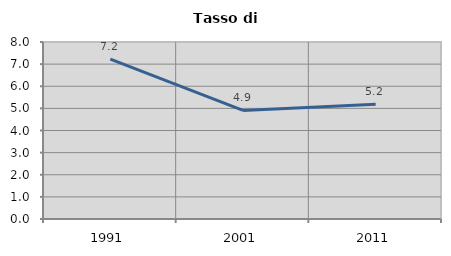
| Category | Tasso di disoccupazione   |
|---|---|
| 1991.0 | 7.224 |
| 2001.0 | 4.907 |
| 2011.0 | 5.19 |